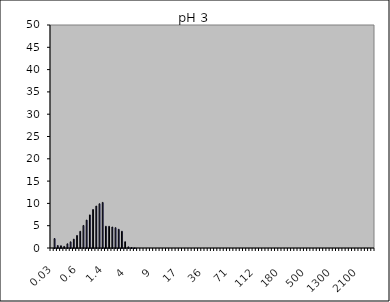
| Category | Magnetite pH 3 1 |
|---|---|
| 0.03 | 0 |
| 0.04 | 2.113 |
| 0.07 | 0.554 |
| 0.1 | 0.501 |
| 0.2 | 0.353 |
| 0.3 | 0.941 |
| 0.4 | 1.39 |
| 0.5 | 1.983 |
| 0.6 | 2.807 |
| 0.7 | 3.746 |
| 0.8 | 5.053 |
| 0.9 | 6.255 |
| 1.0 | 7.419 |
| 1.1 | 8.635 |
| 1.2 | 9.403 |
| 1.3 | 9.918 |
| 1.4 | 10.22 |
| 1.6 | 4.871 |
| 1.8 | 4.861 |
| 2.0 | 4.708 |
| 2.2 | 4.554 |
| 2.4 | 4.192 |
| 2.6 | 3.751 |
| 3.0 | 1.402 |
| 4.0 | 0.258 |
| 5.0 | 0.093 |
| 6.0 | 0.02 |
| 6.5 | 0 |
| 7.0 | 0 |
| 7.5 | 0 |
| 8.0 | 0 |
| 8.5 | 0 |
| 9.0 | 0 |
| 10.0 | 0 |
| 11.0 | 0 |
| 12.0 | 0 |
| 13.0 | 0 |
| 14.0 | 0 |
| 15.0 | 0 |
| 16.0 | 0 |
| 17.0 | 0 |
| 18.0 | 0 |
| 19.0 | 0 |
| 20.0 | 0 |
| 22.0 | 0 |
| 25.0 | 0 |
| 28.0 | 0 |
| 32.0 | 0 |
| 36.0 | 0 |
| 38.0 | 0 |
| 40.0 | 0 |
| 45.0 | 0 |
| 50.0 | 0 |
| 53.0 | 0 |
| 56.0 | 0 |
| 63.0 | 0 |
| 71.0 | 0 |
| 75.0 | 0 |
| 80.0 | 0 |
| 85.0 | 0 |
| 90.0 | 0 |
| 95.0 | 0 |
| 100.0 | 0 |
| 106.0 | 0 |
| 112.0 | 0 |
| 125.0 | 0 |
| 130.0 | 0 |
| 140.0 | 0 |
| 145.0 | 0 |
| 150.0 | 0 |
| 160.0 | 0 |
| 170.0 | 0 |
| 180.0 | 0 |
| 190.0 | 0 |
| 200.0 | 0 |
| 212.0 | 0 |
| 242.0 | 0 |
| 250.0 | 0 |
| 300.0 | 0 |
| 400.0 | 0 |
| 500.0 | 0 |
| 600.0 | 0 |
| 700.0 | 0 |
| 800.0 | 0 |
| 900.0 | 0 |
| 1000.0 | 0 |
| 1100.0 | 0 |
| 1200.0 | 0 |
| 1300.0 | 0 |
| 1400.0 | 0 |
| 1500.0 | 0 |
| 1600.0 | 0 |
| 1700.0 | 0 |
| 1800.0 | 0 |
| 1900.0 | 0 |
| 2000.0 | 0 |
| 2100.0 | 0 |
| 2200.0 | 0 |
| 2300.0 | 0 |
| 2400.0 | 0 |
| 2500.0 | 0 |